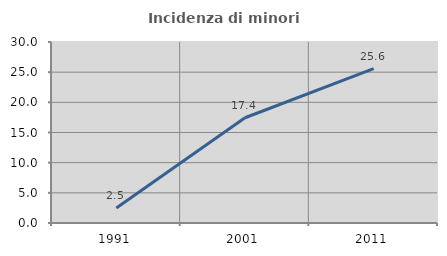
| Category | Incidenza di minori stranieri |
|---|---|
| 1991.0 | 2.5 |
| 2001.0 | 17.442 |
| 2011.0 | 25.602 |